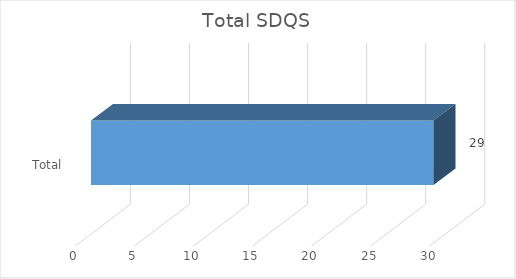
| Category | Total |
|---|---|
| Total | 29 |